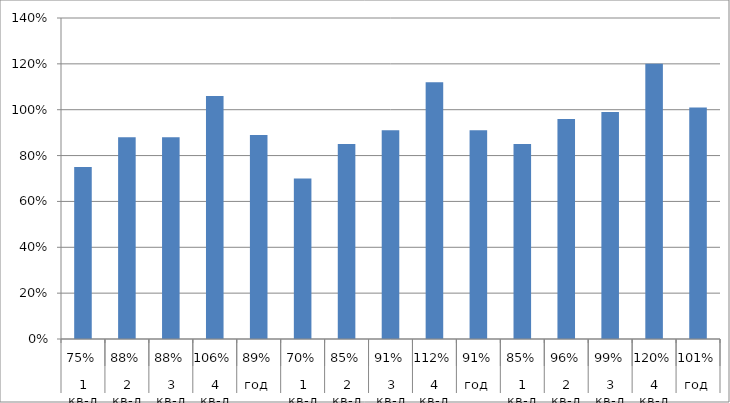
| Category | Series 0 |
|---|---|
| 0 | 0.75 |
| 1 | 0.88 |
| 2 | 0.88 |
| 3 | 1.06 |
| 4 | 0.89 |
| 5 | 0.7 |
| 6 | 0.85 |
| 7 | 0.91 |
| 8 | 1.12 |
| 9 | 0.91 |
| 10 | 0.85 |
| 11 | 0.96 |
| 12 | 0.99 |
| 13 | 1.2 |
| 14 | 1.01 |